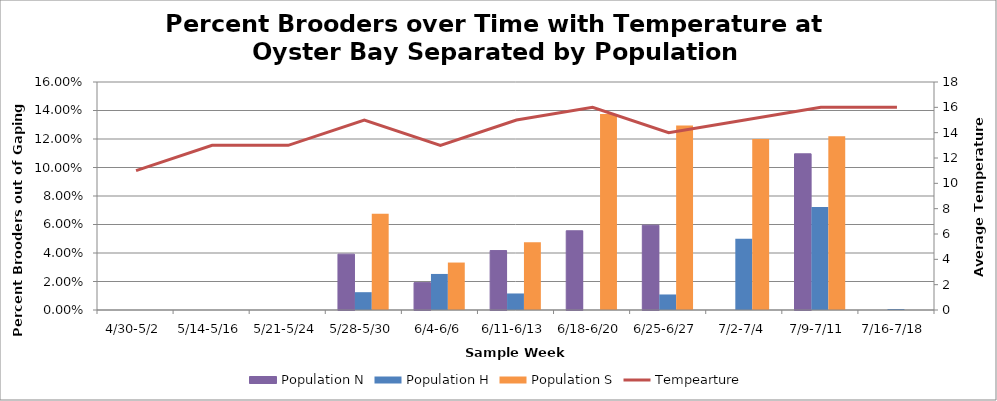
| Category | Population N | Population H | Population S |
|---|---|---|---|
| 4/30-5/2 | 0 | 0 | 0 |
| 5/14-5/16 | 0 | 0 | 0 |
| 5/21-5/24 | 0 | 0 | 0 |
| 5/28-5/30 | 0.039 | 0.012 | 0.068 |
| 6/4-6/6 | 0.019 | 0.025 | 0.033 |
| 6/11-6/13 | 0.042 | 0.012 | 0.048 |
| 6/18-6/20 | 0.056 | 0 | 0.138 |
| 6/25-6/27 | 0.06 | 0.011 | 0.129 |
| 7/2-7/4 | 0 | 0.05 | 0.12 |
| 7/9-7/11 | 0.11 | 0.072 | 0.122 |
| 7/16-7/18 | 0 | 0.001 | 0 |